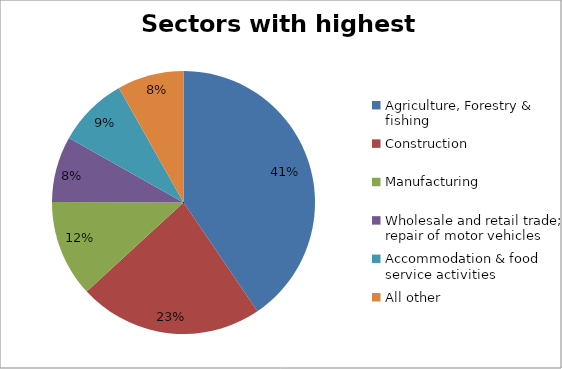
| Category | Sectors with highest totals | Percentage |
|---|---|---|
| Agriculture, Forestry & fishing | 86068 | 0.405 |
| Construction | 48163 | 0.227 |
| Manufacturing | 25317 | 0.119 |
| Wholesale and retail trade; repair of motor vehicles  | 17206 | 0.081 |
| Accommodation & food service activities | 18405 | 0.087 |
| All other | 17365 | 0.082 |